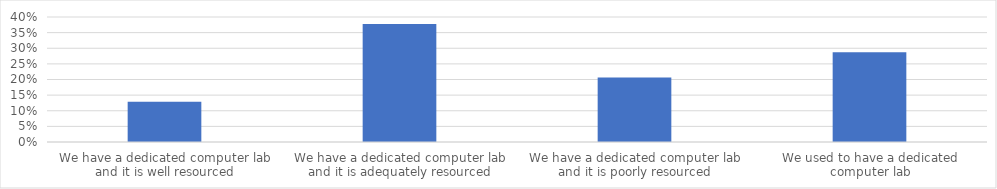
| Category | % of Respondents |
|---|---|
| We have a dedicated computer lab and it is well resourced | 0.129 |
| We have a dedicated computer lab and it is adequately resourced | 0.378 |
| We have a dedicated computer lab and it is poorly resourced | 0.206 |
| We used to have a dedicated computer lab | 0.288 |